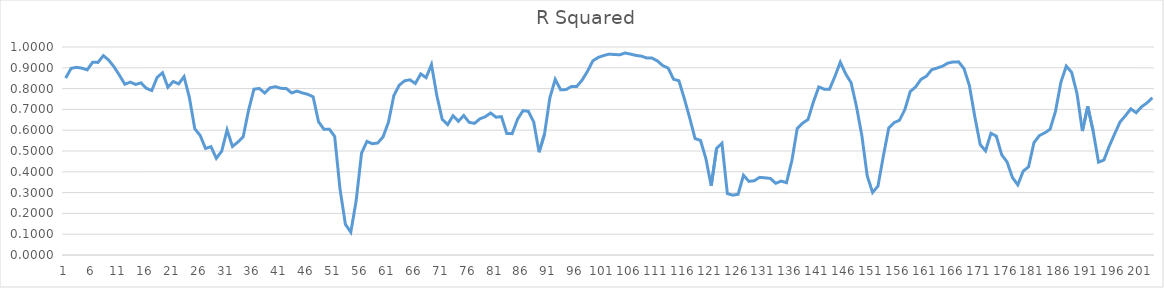
| Category | Series 0 |
|---|---|
| 0 | 0.85 |
| 1 | 0.897 |
| 2 | 0.902 |
| 3 | 0.898 |
| 4 | 0.89 |
| 5 | 0.927 |
| 6 | 0.926 |
| 7 | 0.958 |
| 8 | 0.937 |
| 9 | 0.904 |
| 10 | 0.864 |
| 11 | 0.821 |
| 12 | 0.831 |
| 13 | 0.82 |
| 14 | 0.828 |
| 15 | 0.801 |
| 16 | 0.791 |
| 17 | 0.854 |
| 18 | 0.876 |
| 19 | 0.806 |
| 20 | 0.834 |
| 21 | 0.822 |
| 22 | 0.858 |
| 23 | 0.757 |
| 24 | 0.607 |
| 25 | 0.575 |
| 26 | 0.512 |
| 27 | 0.521 |
| 28 | 0.465 |
| 29 | 0.499 |
| 30 | 0.601 |
| 31 | 0.522 |
| 32 | 0.543 |
| 33 | 0.569 |
| 34 | 0.697 |
| 35 | 0.797 |
| 36 | 0.801 |
| 37 | 0.779 |
| 38 | 0.804 |
| 39 | 0.809 |
| 40 | 0.801 |
| 41 | 0.801 |
| 42 | 0.779 |
| 43 | 0.788 |
| 44 | 0.779 |
| 45 | 0.773 |
| 46 | 0.76 |
| 47 | 0.641 |
| 48 | 0.605 |
| 49 | 0.605 |
| 50 | 0.57 |
| 51 | 0.316 |
| 52 | 0.147 |
| 53 | 0.11 |
| 54 | 0.261 |
| 55 | 0.49 |
| 56 | 0.546 |
| 57 | 0.535 |
| 58 | 0.538 |
| 59 | 0.568 |
| 60 | 0.638 |
| 61 | 0.766 |
| 62 | 0.816 |
| 63 | 0.837 |
| 64 | 0.842 |
| 65 | 0.824 |
| 66 | 0.871 |
| 67 | 0.853 |
| 68 | 0.916 |
| 69 | 0.765 |
| 70 | 0.652 |
| 71 | 0.627 |
| 72 | 0.669 |
| 73 | 0.643 |
| 74 | 0.671 |
| 75 | 0.638 |
| 76 | 0.633 |
| 77 | 0.655 |
| 78 | 0.665 |
| 79 | 0.683 |
| 80 | 0.662 |
| 81 | 0.665 |
| 82 | 0.584 |
| 83 | 0.583 |
| 84 | 0.653 |
| 85 | 0.694 |
| 86 | 0.691 |
| 87 | 0.64 |
| 88 | 0.494 |
| 89 | 0.58 |
| 90 | 0.755 |
| 91 | 0.844 |
| 92 | 0.795 |
| 93 | 0.795 |
| 94 | 0.81 |
| 95 | 0.81 |
| 96 | 0.841 |
| 97 | 0.883 |
| 98 | 0.934 |
| 99 | 0.95 |
| 100 | 0.959 |
| 101 | 0.966 |
| 102 | 0.964 |
| 103 | 0.963 |
| 104 | 0.971 |
| 105 | 0.966 |
| 106 | 0.96 |
| 107 | 0.956 |
| 108 | 0.947 |
| 109 | 0.947 |
| 110 | 0.933 |
| 111 | 0.91 |
| 112 | 0.899 |
| 113 | 0.845 |
| 114 | 0.838 |
| 115 | 0.752 |
| 116 | 0.659 |
| 117 | 0.56 |
| 118 | 0.551 |
| 119 | 0.465 |
| 120 | 0.332 |
| 121 | 0.512 |
| 122 | 0.537 |
| 123 | 0.295 |
| 124 | 0.288 |
| 125 | 0.292 |
| 126 | 0.383 |
| 127 | 0.354 |
| 128 | 0.357 |
| 129 | 0.373 |
| 130 | 0.371 |
| 131 | 0.368 |
| 132 | 0.345 |
| 133 | 0.355 |
| 134 | 0.348 |
| 135 | 0.454 |
| 136 | 0.609 |
| 137 | 0.634 |
| 138 | 0.652 |
| 139 | 0.736 |
| 140 | 0.808 |
| 141 | 0.797 |
| 142 | 0.797 |
| 143 | 0.859 |
| 144 | 0.927 |
| 145 | 0.871 |
| 146 | 0.829 |
| 147 | 0.714 |
| 148 | 0.575 |
| 149 | 0.381 |
| 150 | 0.301 |
| 151 | 0.331 |
| 152 | 0.476 |
| 153 | 0.61 |
| 154 | 0.636 |
| 155 | 0.648 |
| 156 | 0.699 |
| 157 | 0.786 |
| 158 | 0.808 |
| 159 | 0.844 |
| 160 | 0.86 |
| 161 | 0.891 |
| 162 | 0.899 |
| 163 | 0.908 |
| 164 | 0.923 |
| 165 | 0.928 |
| 166 | 0.929 |
| 167 | 0.896 |
| 168 | 0.814 |
| 169 | 0.665 |
| 170 | 0.531 |
| 171 | 0.501 |
| 172 | 0.585 |
| 173 | 0.572 |
| 174 | 0.482 |
| 175 | 0.448 |
| 176 | 0.372 |
| 177 | 0.337 |
| 178 | 0.403 |
| 179 | 0.424 |
| 180 | 0.54 |
| 181 | 0.574 |
| 182 | 0.587 |
| 183 | 0.605 |
| 184 | 0.69 |
| 185 | 0.83 |
| 186 | 0.908 |
| 187 | 0.879 |
| 188 | 0.776 |
| 189 | 0.596 |
| 190 | 0.714 |
| 191 | 0.596 |
| 192 | 0.446 |
| 193 | 0.457 |
| 194 | 0.523 |
| 195 | 0.582 |
| 196 | 0.639 |
| 197 | 0.67 |
| 198 | 0.703 |
| 199 | 0.684 |
| 200 | 0.713 |
| 201 | 0.731 |
| 202 | 0.756 |